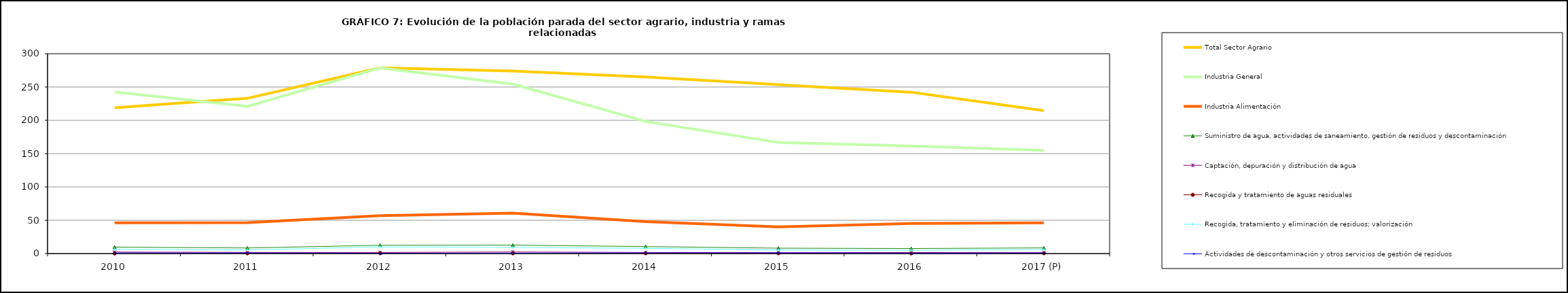
| Category | Total Sector Agrario | Industria General | Industria Alimentación | Suministro de agua, actividades de saneamiento, gestión de residuos y descontaminación  | Captación, depuración y distribución de agua         | Recogida y tratamiento de aguas residuales                                                                                 | Recogida, tratamiento y eliminación de residuos; valorización       | Actividades de descontaminación y otros servicios de gestión de residuos  |
|---|---|---|---|---|---|---|---|---|
| 2010 | 218.925 | 242.575 | 46.15 | 9.725 | 2.25 | 0.225 | 6.475 | 0.8 |
| 2011 | 233.075 | 220.925 | 46.525 | 8.375 | 1.675 | 0.325 | 5.45 | 0.85 |
| 2012 | 278.9 | 278.675 | 56.8 | 12.475 | 1.6 | 0.5 | 9.975 | 0.45 |
| 2013 | 273.925 | 254.3 | 60.8 | 12.7 | 2.4 | 0.3 | 9.3 | 0.6 |
| 2014 | 265.1 | 198.3 | 47.85 | 10.5 | 1.6 | 0.4 | 7.9 | 0.8 |
| 2015 | 253.575 | 166.725 | 40.1 | 8.1 | 1.3 | 0.5 | 5.3 | 1 |
| 2016 | 242.2 | 161.6 | 45.23 | 7.6 | 1.5 | 0.3 | 5.1 | 0.5 |
| 2017 (P) | 214.5 | 154.8 | 46.3 | 8.5 | 1.3 | 0.5 | 5.9 | 0.8 |